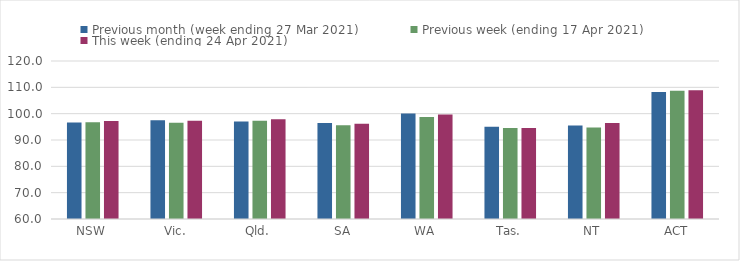
| Category | Previous month (week ending 27 Mar 2021) | Previous week (ending 17 Apr 2021) | This week (ending 24 Apr 2021) |
|---|---|---|---|
| NSW | 96.68 | 96.77 | 97.26 |
| Vic. | 97.46 | 96.51 | 97.34 |
| Qld. | 97.02 | 97.29 | 97.87 |
| SA | 96.41 | 95.56 | 96.21 |
| WA | 100.02 | 98.77 | 99.64 |
| Tas. | 94.99 | 94.57 | 94.57 |
| NT | 95.52 | 94.72 | 96.5 |
| ACT | 108.24 | 108.72 | 108.91 |